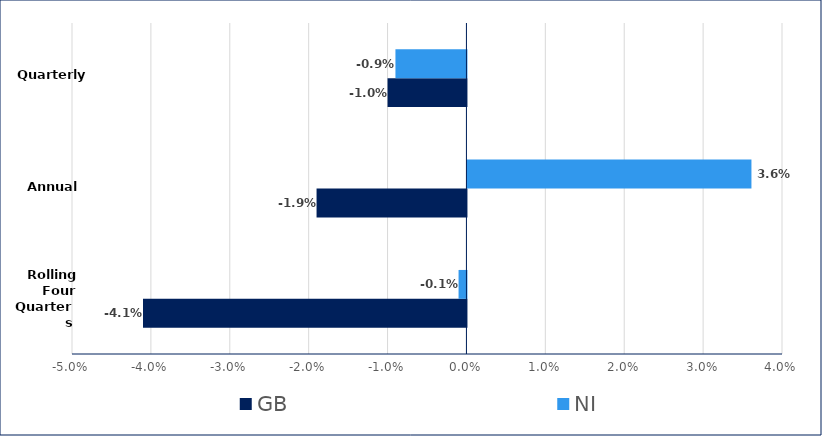
| Category | GB | NI |
|---|---|---|
|  | -0.041 | -0.001 |
|  | -0.019 | 0.036 |
|  | -0.01 | -0.009 |